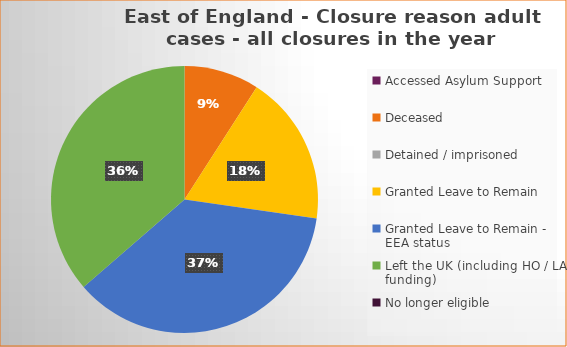
| Category | Total | Percentage |
|---|---|---|
| Accessed Asylum Support | 0 | 0 |
| Deceased | 1 | 0.091 |
| Detained / imprisoned | 0 | 0 |
| Granted Leave to Remain | 2 | 0.182 |
| Granted Leave to Remain - EEA status | 4 | 0.37 |
| Left the UK (including HO / LA funding)  | 4 | 0.364 |
| No longer eligible | 0 | 0 |